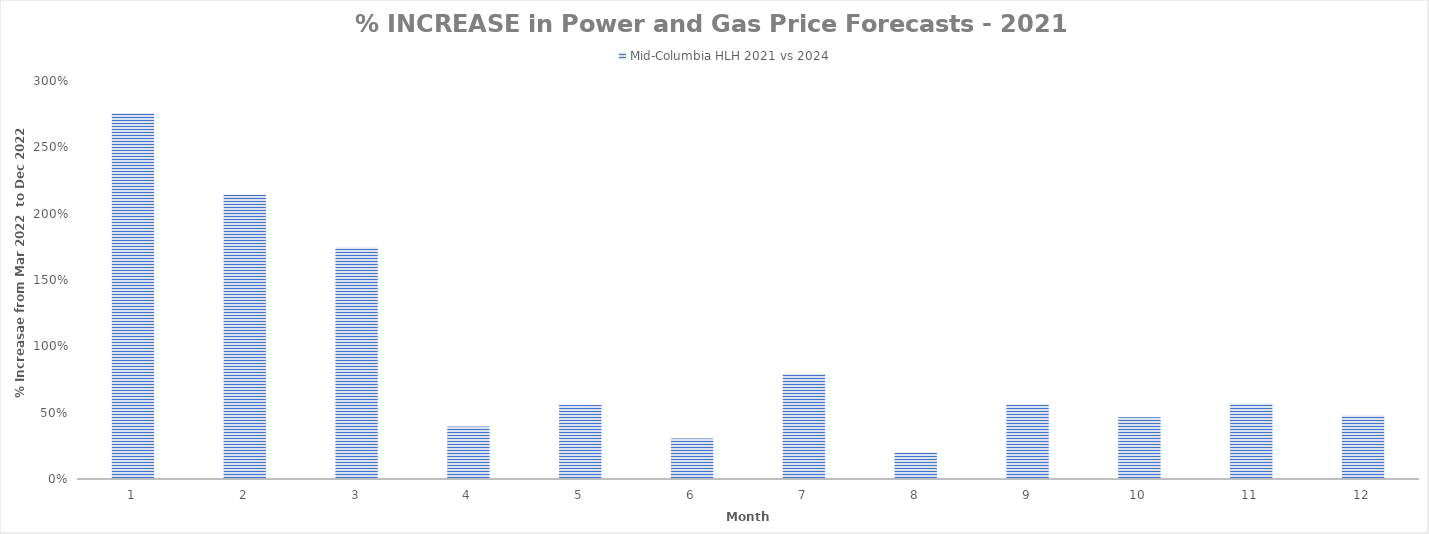
| Category | Mid-Columbia HLH 2021 vs 2024 |
|---|---|
| 0 | 2.756 |
| 1 | 2.144 |
| 2 | 1.745 |
| 3 | 0.396 |
| 4 | 0.559 |
| 5 | 0.305 |
| 6 | 0.794 |
| 7 | 0.2 |
| 8 | 0.564 |
| 9 | 0.466 |
| 10 | 0.568 |
| 11 | 0.478 |